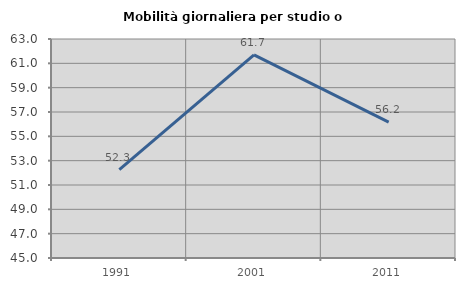
| Category | Mobilità giornaliera per studio o lavoro |
|---|---|
| 1991.0 | 52.268 |
| 2001.0 | 61.696 |
| 2011.0 | 56.174 |